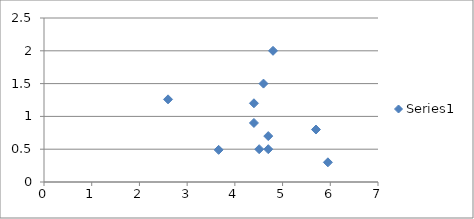
| Category | Series 0 |
|---|---|
| 2.6 | 1.26 |
| 3.66 | 0.49 |
| 4.51 | 0.5 |
| 4.8 | 2 |
| 4.6 | 1.5 |
| 4.4 | 0.9 |
| 5.95 | 0.3 |
| 4.4 | 1.2 |
| 4.7 | 0.5 |
| 5.7 | 0.8 |
| 4.7 | 0.7 |